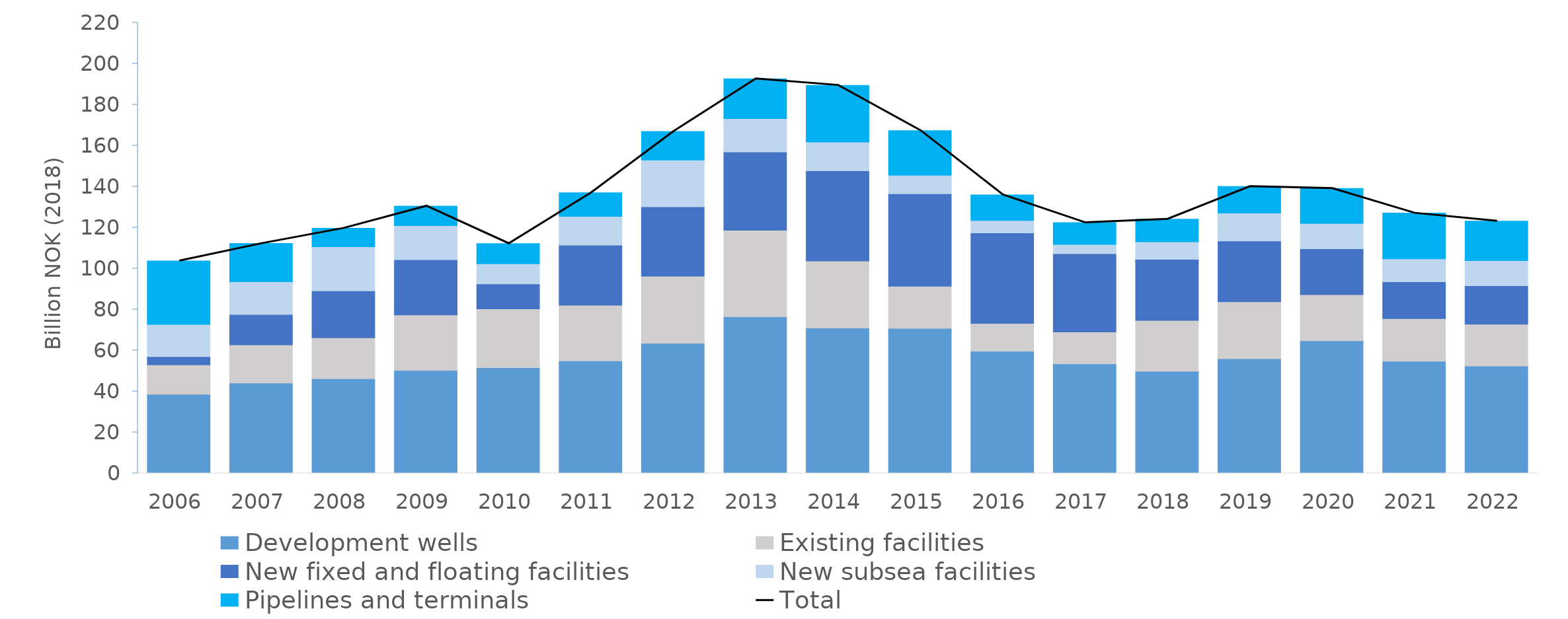
| Category | Development wells | Existing facilities | New fixed and floating facilities | New subsea facilities | Pipelines and terminals |
|---|---|---|---|---|---|
| 2006.0 | 38.638 | 14.354 | 3.991 | 15.783 | 30.919 |
| 2007.0 | 44.126 | 18.625 | 14.85 | 15.915 | 18.709 |
| 2008.0 | 46.211 | 19.99 | 22.925 | 21.51 | 9.082 |
| 2009.0 | 50.353 | 26.964 | 27.078 | 16.559 | 9.551 |
| 2010.0 | 51.606 | 28.743 | 12.162 | 9.821 | 9.867 |
| 2011.0 | 54.883 | 27.188 | 29.373 | 14.018 | 11.567 |
| 2012.0 | 63.541 | 32.787 | 33.855 | 22.832 | 13.884 |
| 2013.0 | 76.45 | 42.236 | 38.212 | 16.329 | 19.437 |
| 2014.0 | 70.951 | 32.797 | 43.98 | 14.027 | 27.72 |
| 2015.0 | 70.778 | 20.622 | 45.171 | 8.994 | 21.81 |
| 2016.0 | 59.694 | 13.55 | 44.139 | 6.068 | 12.545 |
| 2017.0 | 53.472 | 15.588 | 38.234 | 4.509 | 10.593 |
| 2018.0 | 49.87 | 24.801 | 29.876 | 8.513 | 11.083 |
| 2019.0 | 55.992 | 27.802 | 29.669 | 13.617 | 12.99 |
| 2020.0 | 64.739 | 22.495 | 22.422 | 12.336 | 17.084 |
| 2021.0 | 54.759 | 20.814 | 17.998 | 11.193 | 22.292 |
| 2022.0 | 52.453 | 20.377 | 18.803 | 12.202 | 19.321 |